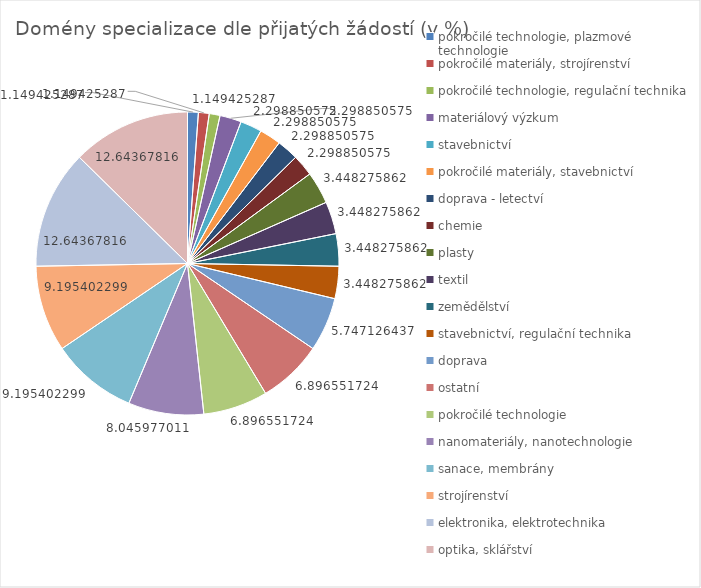
| Category | Celkový součet v % |
|---|---|
| pokročilé technologie, plazmové technologie | 1.149 |
| pokročilé materiály, strojírenství | 1.149 |
| pokročilé technologie, regulační technika | 1.149 |
| materiálový výzkum | 2.299 |
| stavebnictví | 2.299 |
| pokročilé materiály, stavebnictví | 2.299 |
| doprava - letectví | 2.299 |
| chemie | 2.299 |
| plasty | 3.448 |
| textil | 3.448 |
| zemědělství | 3.448 |
| stavebnictví, regulační technika | 3.448 |
| doprava | 5.747 |
| ostatní | 6.897 |
| pokročilé technologie | 6.897 |
| nanomateriály, nanotechnologie | 8.046 |
| sanace, membrány | 9.195 |
| strojírenství | 9.195 |
| elektronika, elektrotechnika | 12.644 |
| optika, sklářství | 12.644 |